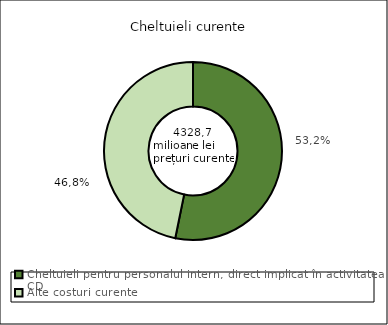
| Category | Series 0 |
|---|---|
| Cheltuieli pentru personalul intern, direct implicat în activitatea CD | 0.532 |
| Alte costuri curente | 0.468 |